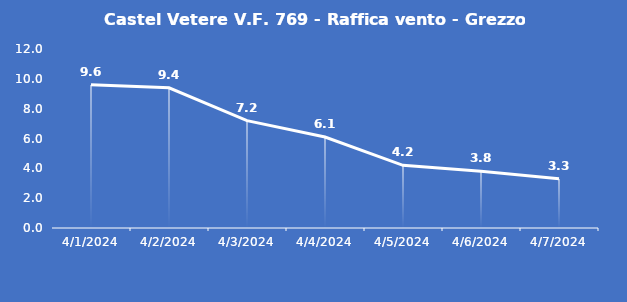
| Category | Castel Vetere V.F. 769 - Raffica vento - Grezzo (m/s) |
|---|---|
| 4/1/24 | 9.6 |
| 4/2/24 | 9.4 |
| 4/3/24 | 7.2 |
| 4/4/24 | 6.1 |
| 4/5/24 | 4.2 |
| 4/6/24 | 3.8 |
| 4/7/24 | 3.3 |